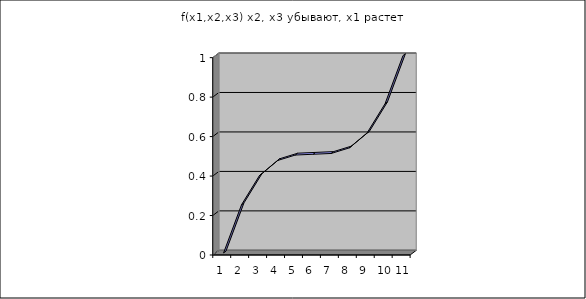
| Category | f(x1,x2,x3) x2, x3 убывают, x1 растет |
|---|---|
| 0 | 0 |
| 1 | 0.244 |
| 2 | 0.392 |
| 3 | 0.468 |
| 4 | 0.496 |
| 5 | 0.5 |
| 6 | 0.504 |
| 7 | 0.532 |
| 8 | 0.608 |
| 9 | 0.756 |
| 10 | 1 |